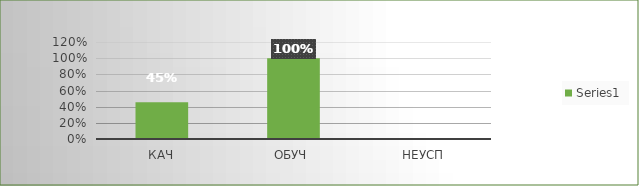
| Category | Series 0 |
|---|---|
| кач | 0.455 |
| обуч | 1 |
| неусп | 0 |